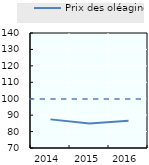
| Category | Prix des oléagineux |
|---|---|
| 2014.0 | 87.426 |
| 2015.0 | 84.94 |
| 2016.0 | 86.589 |